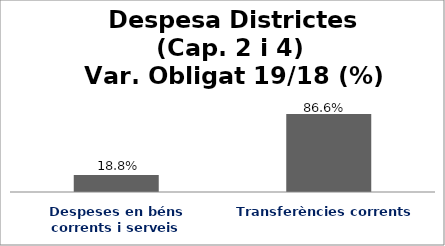
| Category | Series 0 |
|---|---|
| Despeses en béns corrents i serveis | 0.188 |
| Transferències corrents | 0.866 |